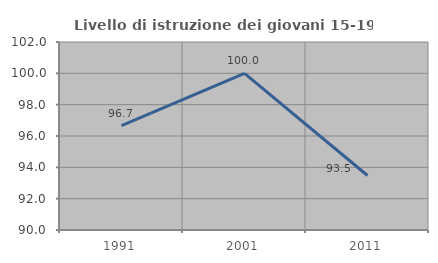
| Category | Livello di istruzione dei giovani 15-19 anni |
|---|---|
| 1991.0 | 96.667 |
| 2001.0 | 100 |
| 2011.0 | 93.478 |